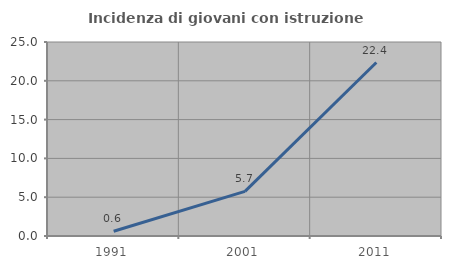
| Category | Incidenza di giovani con istruzione universitaria |
|---|---|
| 1991.0 | 0.617 |
| 2001.0 | 5.747 |
| 2011.0 | 22.353 |